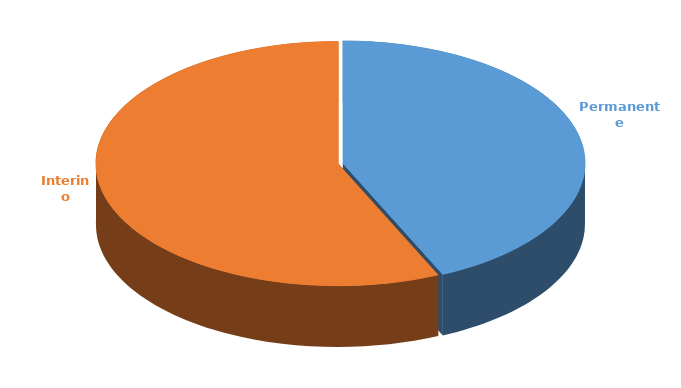
| Category | Cantidad |
|---|---|
| Permanente | 2694 |
| Interino | 3539 |